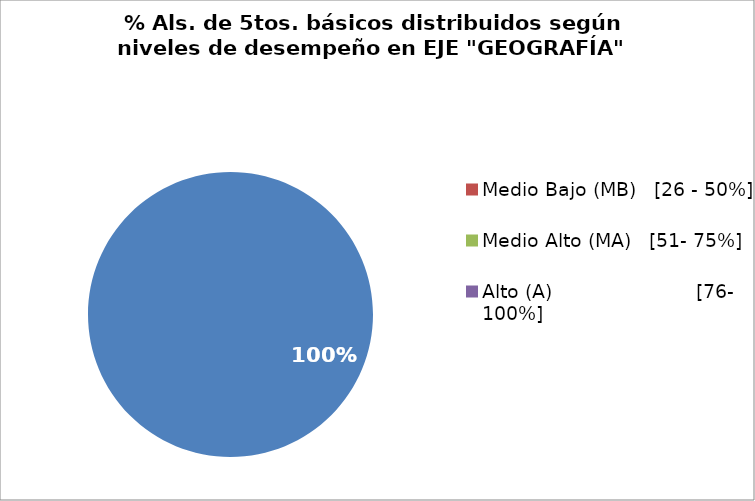
| Category | Series 0 |
|---|---|
| Bajo (B)                        [0 - 25%] | 1 |
| Medio Bajo (MB)   [26 - 50%] | 0 |
| Medio Alto (MA)   [51- 75%] | 0 |
| Alto (A)                        [76- 100%] | 0 |